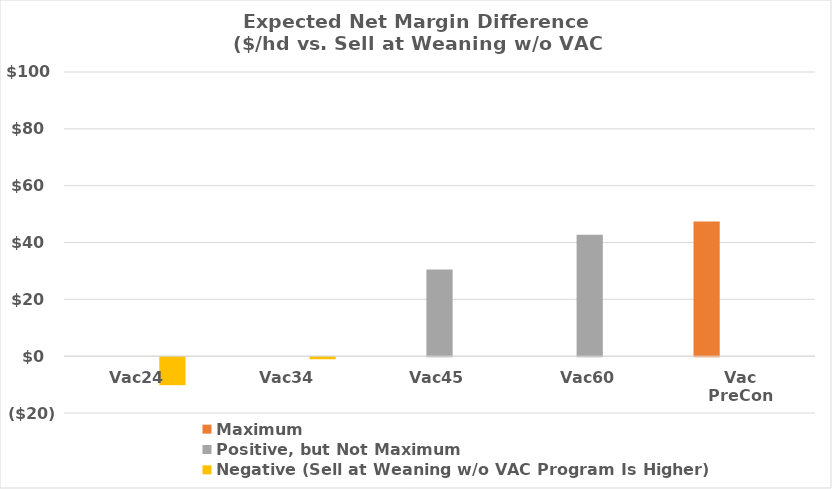
| Category | Maximum | Positive, but Not Maximum | Negative (Sell at Weaning w/o VAC Program Is Higher) |
|---|---|---|---|
| Vac24 | 0 | 0 | -9.868 |
| Vac34 | 0 | 0 | -0.732 |
| Vac45 | 0 | 30.469 | 0 |
| Vac60 | 0 | 42.752 | 0 |
| Vac PreCon | 47.373 | 0 | 0 |